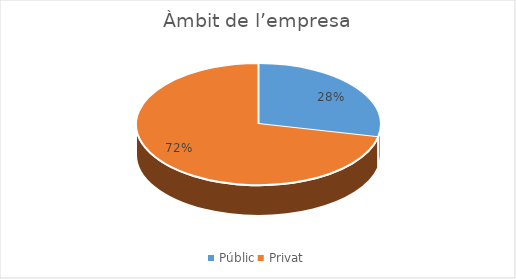
| Category | Series 0 |
|---|---|
| Públic | 31 |
| Privat | 78 |